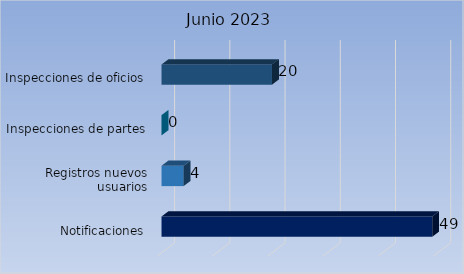
| Category | Cantidad |
|---|---|
| Notificaciones | 49 |
| Registros nuevos usuarios | 4 |
| Inspecciones de partes | 0 |
| Inspecciones de oficios | 20 |